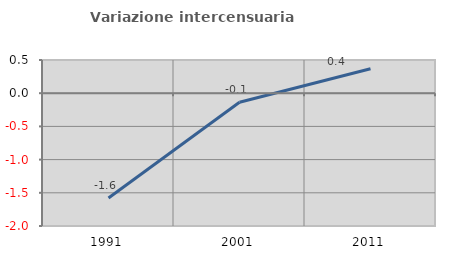
| Category | Variazione intercensuaria annua |
|---|---|
| 1991.0 | -1.579 |
| 2001.0 | -0.136 |
| 2011.0 | 0.367 |